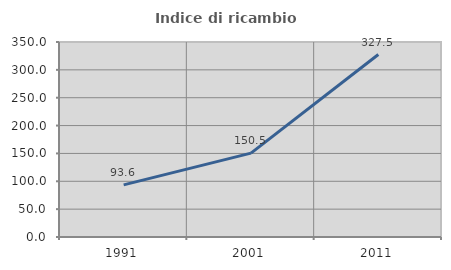
| Category | Indice di ricambio occupazionale  |
|---|---|
| 1991.0 | 93.597 |
| 2001.0 | 150.541 |
| 2011.0 | 327.477 |